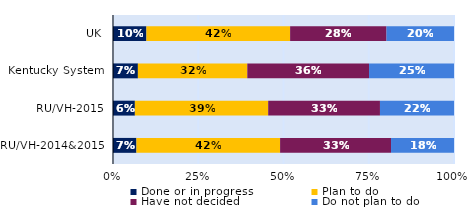
| Category | Done or in progress | Plan to do | Have not decided | Do not plan to do |
|---|---|---|---|---|
| UK | 0.098 | 0.421 | 0.283 | 0.198 |
| Kentucky System | 0.073 | 0.321 | 0.357 | 0.249 |
| RU/VH-2015 | 0.064 | 0.391 | 0.328 | 0.217 |
| RU/VH-2014&2015 | 0.069 | 0.421 | 0.325 | 0.185 |